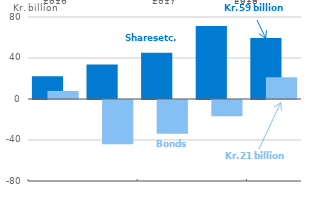
| Category | Shares etc. | Bonds |
|---|---|---|
| 1st half | 22.3 | 7.9 |
| 2nd half | 33.6 | -43.1 |
| 1st half | 45.1 | -32.9 |
| 2nd half | 71.3 | -15.9 |
| 1st half | 59.5 | 21.2 |